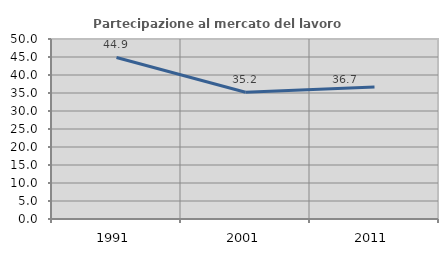
| Category | Partecipazione al mercato del lavoro  femminile |
|---|---|
| 1991.0 | 44.868 |
| 2001.0 | 35.199 |
| 2011.0 | 36.69 |